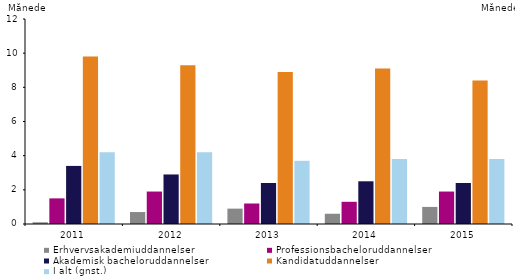
| Category | Erhvervsakademiuddannelser | Professionsbacheloruddannelser | Akademisk bacheloruddannelser | Kandidatuddannelser | I alt (gnst.) |
|---|---|---|---|---|---|
| 2011.0 | 0.1 | 1.5 | 3.4 | 9.8 | 4.2 |
| 2012.0 | 0.7 | 1.9 | 2.9 | 9.3 | 4.2 |
| 2013.0 | 0.9 | 1.2 | 2.4 | 8.9 | 3.7 |
| 2014.0 | 0.6 | 1.3 | 2.5 | 9.1 | 3.8 |
| 2015.0 | 1 | 1.9 | 2.4 | 8.4 | 3.8 |